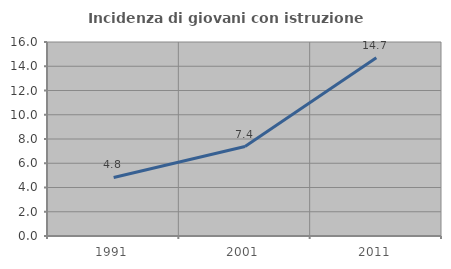
| Category | Incidenza di giovani con istruzione universitaria |
|---|---|
| 1991.0 | 4.826 |
| 2001.0 | 7.38 |
| 2011.0 | 14.698 |